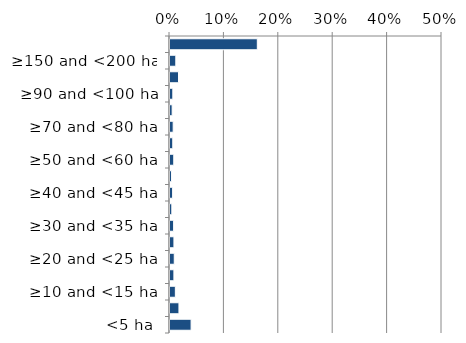
| Category | Native |
|---|---|
| <5 ha | 0.039 |
| ≥5 and <10 ha | 0.016 |
| ≥10 and <15 ha | 0.01 |
| ≥15 and <20 ha | 0.007 |
| ≥20 and <25 ha | 0.008 |
| ≥25 and <30 ha | 0.007 |
| ≥30 and <35 ha | 0.007 |
| ≥35 and <40 ha | 0.003 |
| ≥40 and <45 ha | 0.005 |
| ≥45 and <50 ha | 0.003 |
| ≥50 and <60 ha | 0.007 |
| ≥60 and <70 ha | 0.005 |
| ≥70 and <80 ha | 0.006 |
| ≥80 and <90 ha | 0.004 |
| ≥90 and <100 ha | 0.005 |
| ≥100 and <150 ha | 0.016 |
| ≥150 and <200 ha | 0.011 |
| ≥200 ha | 0.161 |